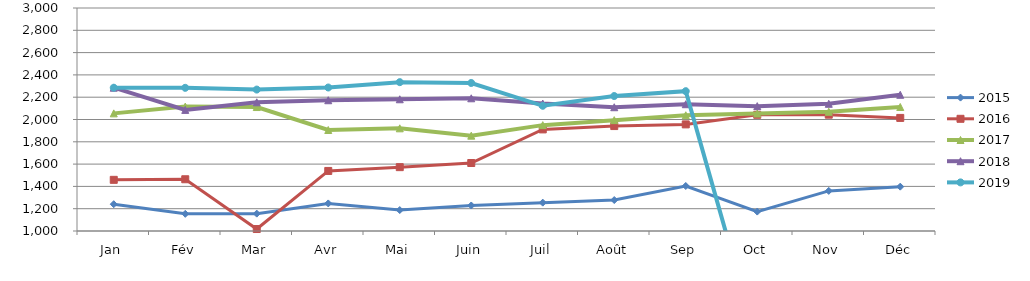
| Category | 2015 | 2016 | 2017 | 2018 | 2019 |
|---|---|---|---|---|---|
| Jan | 1240.199 | 1458.845 | 2054.992 | 2285.077 | 2285.077 |
| Fév | 1154.084 | 1464.053 | 2115.835 | 2086.154 | 2284.041 |
| Mar | 1155.795 | 1017.666 | 2111.775 | 2154.212 | 2268.401 |
| Avr | 1247.289 | 1538.54 | 1905.715 | 2172.757 | 2286.951 |
| Mai | 1187.813 | 1572.628 | 1920.848 | 2181.426 | 2334.869 |
| Juin | 1228.767 | 1609.855 | 1855.021 | 2190.216 | 2327.493 |
| Juil | 1254.312 | 1911.22 | 1949.439 | 2142.84 | 2123.041 |
| Août | 1277.716 | 1941.047 | 1994.139 | 2110.076 | 2210.394 |
| Sep | 1403.643 | 1956.245 | 2038.007 | 2137.072 | 2253.916 |
| Oct | 1174.168 | 2042.155 | 2053.777 | 2119.873 | 0 |
| Nov | 1359.767 | 2043.123 | 2069.501 | 2140.872 | 0 |
| Déc | 1397.582 | 2014.163 | 2112.138 | 2221.568 | 0 |